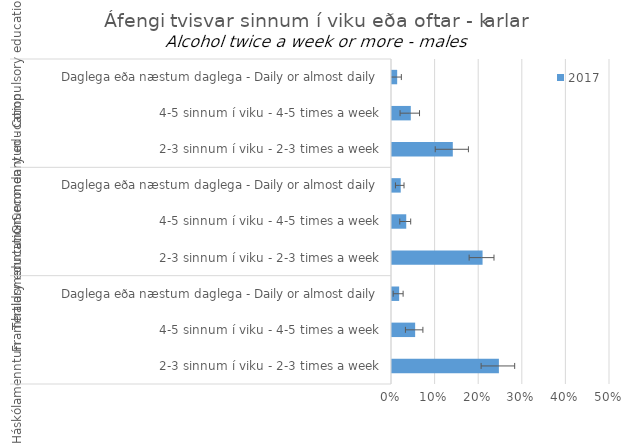
| Category | 2017 |
|---|---|
| 0 | 0.012 |
| 1 | 0.043 |
| 2 | 0.139 |
| 3 | 0.02 |
| 4 | 0.033 |
| 5 | 0.208 |
| 6 | 0.016 |
| 7 | 0.053 |
| 8 | 0.245 |